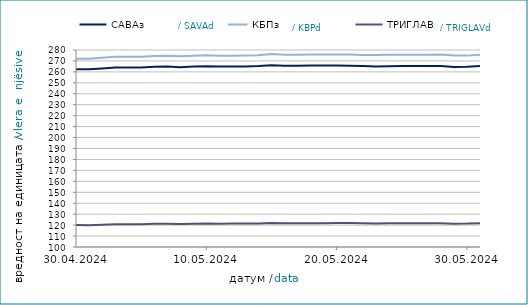
| Category | САВАз | КБПз | ТРИГЛАВз |
|---|---|---|---|
| 2024-04-30 | 262.456 | 272.085 | 120.057 |
| 2024-05-01 | 262.364 | 271.906 | 119.986 |
| 2024-05-02 | 263.146 | 272.814 | 120.37 |
| 2024-05-03 | 263.955 | 273.828 | 120.839 |
| 2024-05-04 | 263.972 | 273.845 | 120.848 |
| 2024-05-05 | 263.989 | 273.862 | 120.857 |
| 2024-05-06 | 264.64 | 274.623 | 121.209 |
| 2024-05-07 | 264.874 | 274.758 | 121.3 |
| 2024-05-08 | 264.327 | 274.246 | 121.079 |
| 2024-05-09 | 264.84 | 274.709 | 121.317 |
| 2024-05-10 | 265.168 | 275.111 | 121.495 |
| 2024-05-11 | 264.886 | 274.804 | 121.353 |
| 2024-05-12 | 264.903 | 274.821 | 121.362 |
| 2024-05-13 | 265.036 | 274.932 | 121.387 |
| 2024-05-14 | 265.37 | 275.287 | 121.554 |
| 2024-05-15 | 266.13 | 276.232 | 121.972 |
| 2024-05-16 | 265.69 | 275.773 | 121.766 |
| 2024-05-17 | 265.578 | 275.646 | 121.722 |
| 2024-05-18 | 265.725 | 275.809 | 121.799 |
| 2024-05-19 | 265.742 | 275.826 | 121.807 |
| 2024-05-20 | 265.838 | 275.988 | 121.851 |
| 2024-05-21 | 265.718 | 275.851 | 121.834 |
| 2024-05-22 | 265.406 | 275.528 | 121.675 |
| 2024-05-23 | 264.948 | 275.355 | 121.536 |
| 2024-05-24 | 265.257 | 275.681 | 121.715 |
| 2024-05-25 | 265.274 | 275.698 | 121.724 |
| 2024-05-26 | 265.291 | 275.715 | 121.733 |
| 2024-05-27 | 265.351 | 275.768 | 121.746 |
| 2024-05-28 | 265.343 | 275.917 | 121.791 |
| 2024-05-29 | 264.386 | 274.872 | 121.336 |
| 2024-05-30 | 264.673 | 274.862 | 121.363 |
| 2024-05-31 | 265.383 | 275.554 | 121.774 |